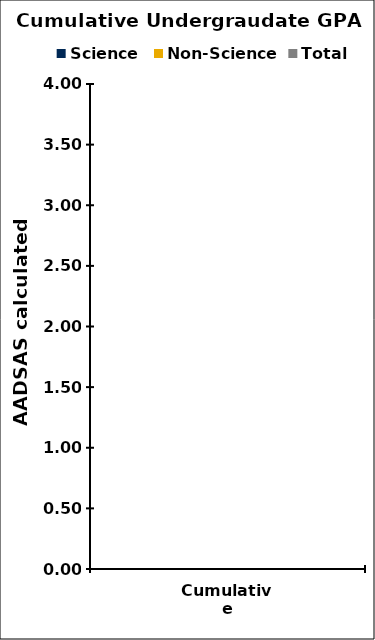
| Category | Science | Non-Science | Total |
|---|---|---|---|
| Cumulative | 0 | 0 | 0 |